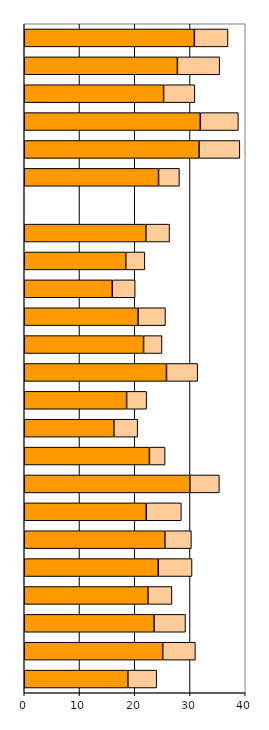
| Category | Series 0 | Series 1 |
|---|---|---|
| 0 | 18.753 | 5.215 |
| 1 | 25.061 | 5.909 |
| 2 | 23.495 | 5.688 |
| 3 | 22.396 | 4.335 |
| 4 | 24.258 | 6.112 |
| 5 | 25.447 | 4.805 |
| 6 | 22.087 | 6.346 |
| 7 | 29.979 | 5.334 |
| 8 | 22.658 | 2.832 |
| 9 | 16.223 | 4.307 |
| 10 | 18.531 | 3.618 |
| 11 | 25.746 | 5.64 |
| 12 | 21.597 | 3.333 |
| 13 | 20.6 | 4.956 |
| 14 | 15.932 | 4.145 |
| 15 | 18.372 | 3.46 |
| 16 | 22.016 | 4.284 |
| 17 | 0 | 0 |
| 18 | 24.31 | 3.776 |
| 19 | 31.648 | 7.374 |
| 20 | 31.865 | 6.89 |
| 21 | 25.223 | 5.655 |
| 22 | 27.721 | 7.647 |
| 23 | 30.791 | 6.083 |